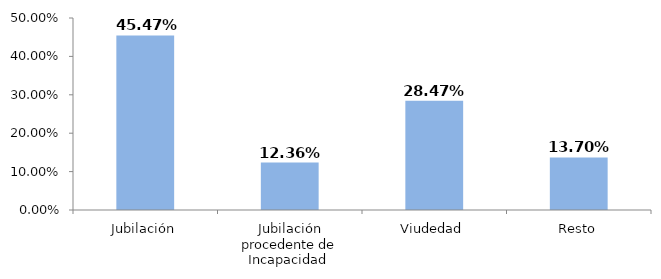
| Category | Series 0 |
|---|---|
| Jubilación | 0.455 |
| Jubilación procedente de Incapacidad  | 0.124 |
| Viudedad | 0.285 |
| Resto | 0.137 |